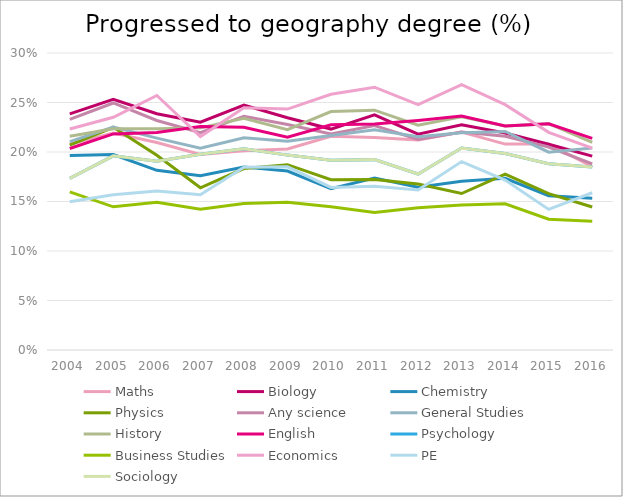
| Category | Maths | Biology | Chemistry | Physics | Any science | General Studies | History | English | Psychology | Business Studies | Economics | PE | Sociology |
|---|---|---|---|---|---|---|---|---|---|---|---|---|---|
| 2004.0 | 0.208 | 0.238 | 0.197 | 0.207 | 0.233 | 0.211 | 0.216 | 0.204 | 0.173 | 0.16 | 0.223 | 0.15 | 0.173 |
| 2005.0 | 0.219 | 0.253 | 0.197 | 0.225 | 0.25 | 0.225 | 0.223 | 0.218 | 0.196 | 0.145 | 0.235 | 0.157 | 0.196 |
| 2006.0 | 0.21 | 0.239 | 0.181 | 0.197 | 0.232 | 0.214 | 0.223 | 0.22 | 0.191 | 0.149 | 0.257 | 0.16 | 0.191 |
| 2007.0 | 0.197 | 0.23 | 0.176 | 0.164 | 0.22 | 0.204 | 0.224 | 0.226 | 0.198 | 0.142 | 0.216 | 0.157 | 0.198 |
| 2008.0 | 0.201 | 0.247 | 0.185 | 0.183 | 0.236 | 0.214 | 0.234 | 0.225 | 0.203 | 0.148 | 0.245 | 0.185 | 0.203 |
| 2009.0 | 0.203 | 0.235 | 0.181 | 0.187 | 0.228 | 0.211 | 0.223 | 0.215 | 0.197 | 0.149 | 0.243 | 0.185 | 0.197 |
| 2010.0 | 0.216 | 0.223 | 0.163 | 0.172 | 0.218 | 0.217 | 0.241 | 0.228 | 0.192 | 0.145 | 0.258 | 0.164 | 0.192 |
| 2011.0 | 0.215 | 0.238 | 0.174 | 0.172 | 0.227 | 0.222 | 0.242 | 0.228 | 0.192 | 0.139 | 0.265 | 0.166 | 0.192 |
| 2012.0 | 0.212 | 0.218 | 0.164 | 0.168 | 0.213 | 0.215 | 0.227 | 0.232 | 0.178 | 0.144 | 0.248 | 0.162 | 0.178 |
| 2013.0 | 0.22 | 0.227 | 0.171 | 0.158 | 0.22 | 0.219 | 0.235 | 0.236 | 0.204 | 0.147 | 0.268 | 0.19 | 0.204 |
| 2014.0 | 0.208 | 0.219 | 0.173 | 0.178 | 0.216 | 0.221 | 0.226 | 0.226 | 0.198 | 0.148 | 0.248 | 0.172 | 0.198 |
| 2015.0 | 0.208 | 0.208 | 0.156 | 0.158 | 0.205 | 0.2 | 0.229 | 0.228 | 0.188 | 0.132 | 0.22 | 0.142 | 0.188 |
| 2016.0 | 0.185 | 0.196 | 0.153 | 0.144 | 0.188 | 0.204 | 0.21 | 0.214 | 0.185 | 0.13 | 0.204 | 0.159 | 0.185 |